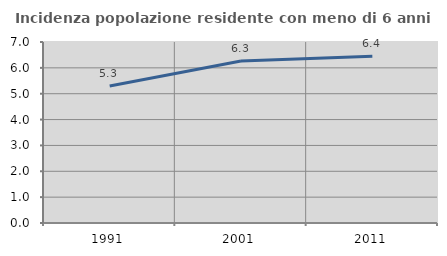
| Category | Incidenza popolazione residente con meno di 6 anni |
|---|---|
| 1991.0 | 5.3 |
| 2001.0 | 6.266 |
| 2011.0 | 6.449 |